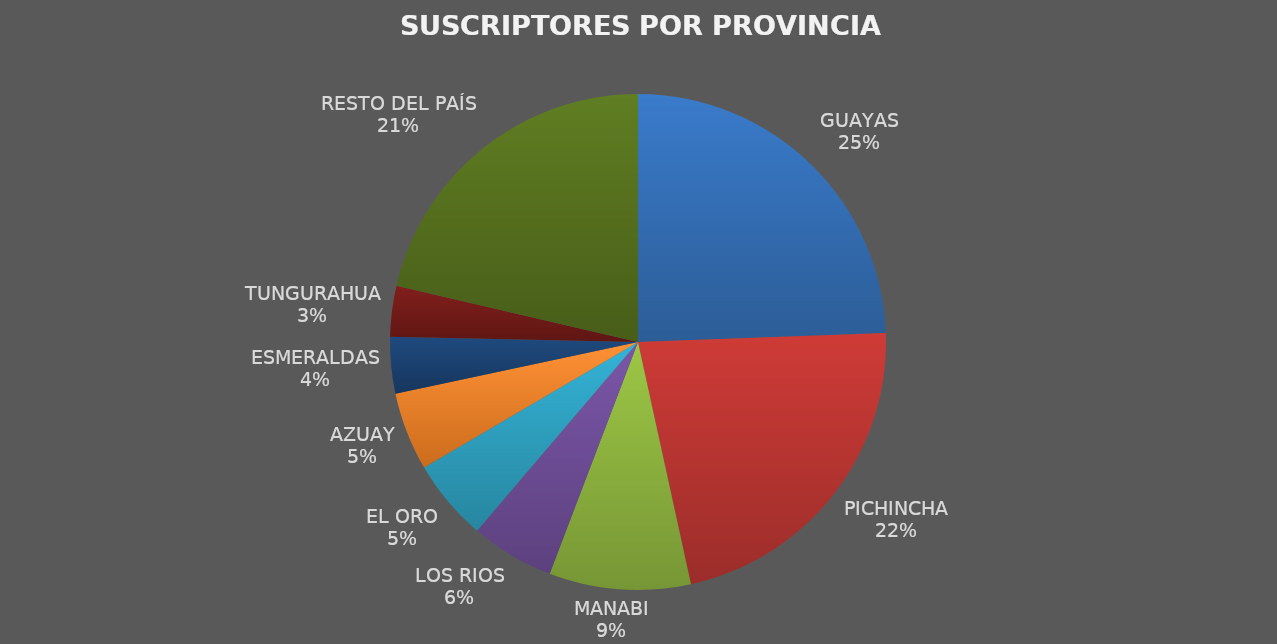
| Category | SUSCRIPTORES POR PROVINCIA (4T) |
|---|---|
| GUAYAS | 0.244 |
| PICHINCHA | 0.222 |
| MANABI | 0.092 |
| LOS RIOS | 0.054 |
| EL ORO | 0.053 |
| AZUAY | 0.051 |
| ESMERALDAS | 0.037 |
| TUNGURAHUA | 0.033 |
| RESTO DEL PAÍS | 0.214 |